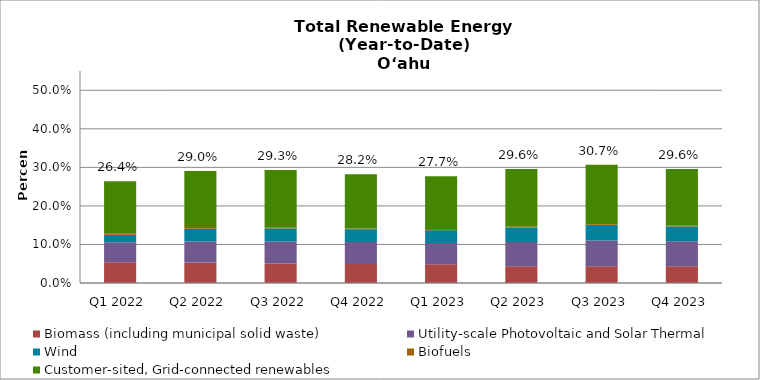
| Category | Biomass (including municipal solid waste) | Utility-scale Photovoltaic and Solar Thermal | Wind | Biofuels | Customer-sited, Grid-connected renewables |
|---|---|---|---|---|---|
| Q1 2022 | 0.054 | 0.052 | 0.019 | 0.003 | 0.136 |
| Q2 2022 | 0.053 | 0.054 | 0.033 | 0.002 | 0.148 |
| Q3 2022 | 0.05 | 0.058 | 0.033 | 0.002 | 0.149 |
| Q4 2022 | 0.049 | 0.057 | 0.033 | 0.002 | 0.141 |
| Q1 2023 | 0.048 | 0.055 | 0.033 | 0.003 | 0.137 |
| Q2 2023 | 0.043 | 0.063 | 0.037 | 0.002 | 0.15 |
| Q3 2023 | 0.043 | 0.067 | 0.041 | 0.002 | 0.154 |
| Q4 2023 | 0.044 | 0.064 | 0.038 | 0.002 | 0.147 |